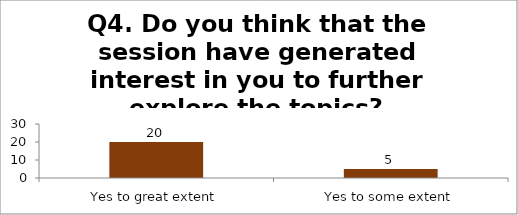
| Category | Q4. Do you think that the session have generated interest in you to further explore the topics? |
|---|---|
| Yes to great extent | 20 |
| Yes to some extent | 5 |